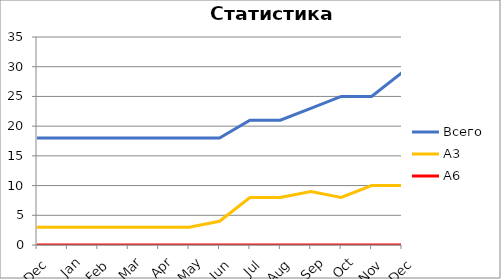
| Category | Всего | А3 | A6 |
|---|---|---|---|
| 0 | 18 | 3 | 0 |
| 1 | 18 | 3 | 0 |
| 2 | 18 | 3 | 0 |
| 3 | 18 | 3 | 0 |
| 4 | 18 | 3 | 0 |
| 5 | 18 | 3 | 0 |
| 6 | 18 | 4 | 0 |
| 7 | 21 | 8 | 0 |
| 8 | 21 | 8 | 0 |
| 9 | 23 | 9 | 0 |
| 10 | 25 | 8 | 0 |
| 11 | 25 | 10 | 0 |
| 12 | 29 | 10 | 0 |